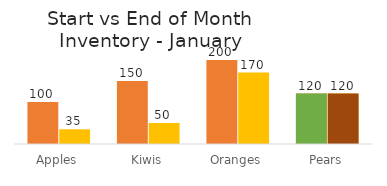
| Category | Starting Inventory | Ending Inventory |
|---|---|---|
| Apples | 100 | 35 |
| Kiwis | 150 | 50 |
| Oranges | 200 | 170 |
| Pears | 120 | 120 |